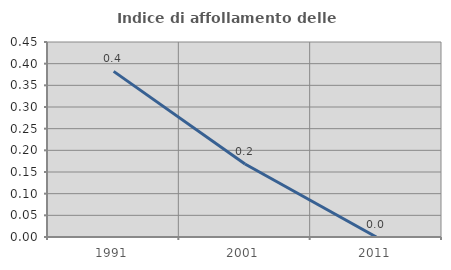
| Category | Indice di affollamento delle abitazioni  |
|---|---|
| 1991.0 | 0.382 |
| 2001.0 | 0.168 |
| 2011.0 | 0 |